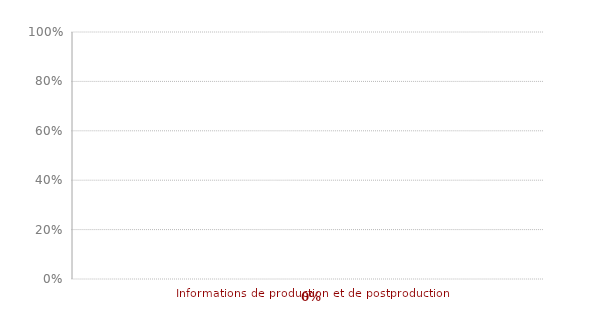
| Category | Art. 9 |
|---|---|
| Informations de production et de postproduction | 0 |